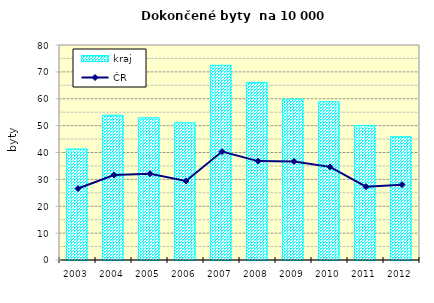
| Category | kraj |
|---|---|
| 2003.0 | 41.285 |
| 2004.0 | 53.852 |
| 2005.0 | 52.898 |
| 2006.0 | 51.066 |
| 2007.0 | 72.441 |
| 2008.0 | 66.085 |
| 2009.0 | 59.863 |
| 2010.0 | 58.901 |
| 2011.0 | 50.083 |
| 2012.0 | 45.881 |